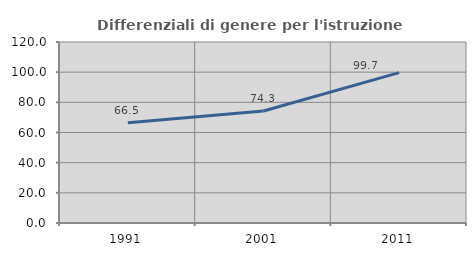
| Category | Differenziali di genere per l'istruzione superiore |
|---|---|
| 1991.0 | 66.526 |
| 2001.0 | 74.286 |
| 2011.0 | 99.712 |